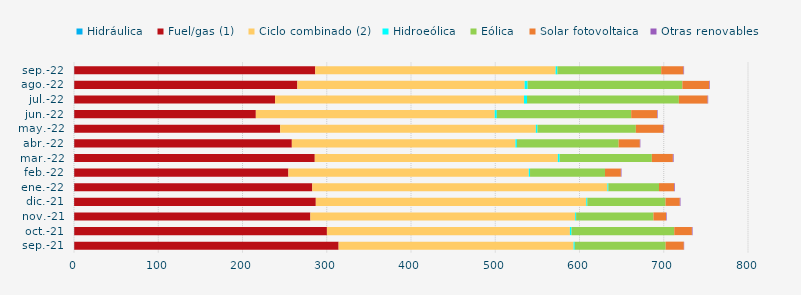
| Category | Hidráulica | Fuel/gas (1) | Ciclo combinado (2) | Hidroeólica | Eólica | Solar fotovoltaica | Otras renovables |
|---|---|---|---|---|---|---|---|
| sep.-21 | 0.278 | 313.815 | 278.888 | 1.42 | 107.853 | 21.565 | 0.4 |
| oct.-21 | 0.282 | 299.917 | 288.429 | 1.853 | 121.987 | 20.979 | 0.756 |
| nov.-21 | 0.231 | 280.341 | 314.273 | 1.14 | 91.77 | 14.946 | 0.753 |
| dic.-21 | 0.155 | 286.856 | 321.013 | 1.228 | 92.868 | 16.937 | 0.822 |
| ene.-22 | 0.294 | 282.523 | 350.314 | 1.111 | 60.137 | 18.039 | 0.861 |
| feb.-22 | 0.251 | 254.215 | 285.333 | 1.482 | 88.97 | 18.864 | 0.721 |
| mar.-22 | 0.296 | 285.489 | 288.518 | 2.126 | 109.436 | 24.968 | 0.91 |
| abr.-22 | 0.274 | 258.292 | 265.373 | 1.753 | 120.763 | 25.165 | 0.614 |
| may.-22 | 0.299 | 244.426 | 303.457 | 1.917 | 116.774 | 32.867 | 0.721 |
| jun.-22 | 0.281 | 215.547 | 283.584 | 2.45 | 159.505 | 30.724 | 0.696 |
| jul.-22 | 0.294 | 238.325 | 295.517 | 3.563 | 180.243 | 34.108 | 0.688 |
| ago.-22 | 0.293 | 264.815 | 269.791 | 3.518 | 183.676 | 31.953 | 0.715 |
| sep.-22 | 0.289 | 286.058 | 285.298 | 2.075 | 123.261 | 26.44 | 0.715 |